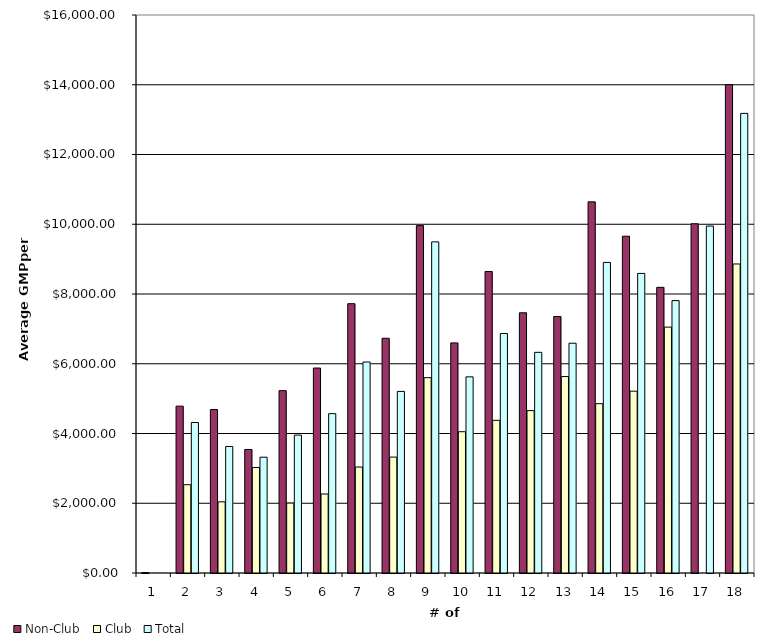
| Category | Non-Club | Club | Total |
|---|---|---|---|
| 1.0 | 9.073 | 0 | 0 |
| 2.0 | 4784.556 | 2531.064 | 4315.078 |
| 3.0 | 4687.436 | 2040.293 | 3628.578 |
| 4.0 | 3542.562 | 3024.755 | 3320.644 |
| 5.0 | 5228.287 | 2005.707 | 3954.244 |
| 6.0 | 5877.25 | 2265.098 | 4569.402 |
| 7.0 | 7722.313 | 3038.24 | 6049.43 |
| 8.0 | 6731.13 | 3323.66 | 5206.736 |
| 9.0 | 9960.84 | 5601.064 | 9495.052 |
| 10.0 | 6598.111 | 4051.213 | 5624.297 |
| 11.0 | 8645.919 | 4377.69 | 6867.49 |
| 12.0 | 7461.746 | 4656.484 | 6327.704 |
| 13.0 | 7353.559 | 5633.001 | 6588.866 |
| 14.0 | 10642.443 | 4855.146 | 8906.254 |
| 15.0 | 9656.718 | 5213.837 | 8590.426 |
| 16.0 | 8191.25 | 7050.21 | 7810.903 |
| 17.0 | 10013.633 | 0 | 9948.726 |
| 18.0 | 14001.624 | 8860.875 | 13178.765 |